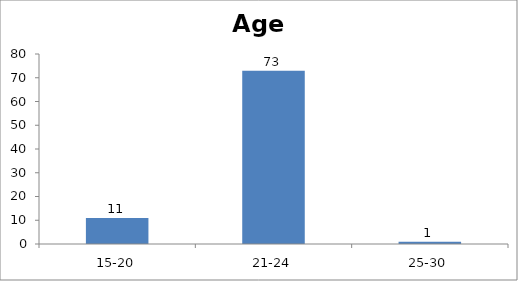
| Category | Age |
|---|---|
| 15-20 | 11 |
| 21-24 | 73 |
| 25-30 | 1 |